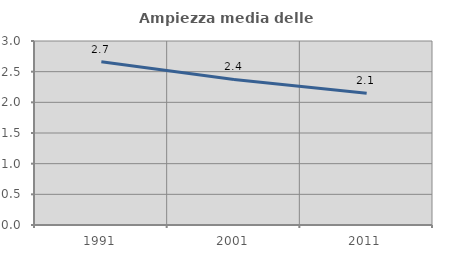
| Category | Ampiezza media delle famiglie |
|---|---|
| 1991.0 | 2.661 |
| 2001.0 | 2.372 |
| 2011.0 | 2.149 |